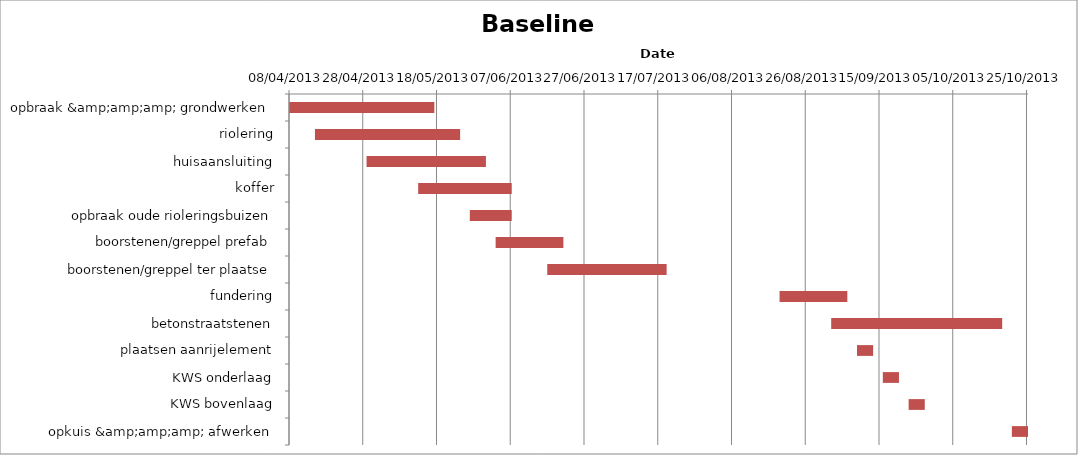
| Category | Baseline start | Actual duration |
|---|---|---|
| opbraak &amp;amp;amp; grondwerken | 41372.333 | 39.375 |
| riolering | 41379.333 | 39.375 |
| huisaansluiting | 41393.333 | 32.375 |
| koffer | 41407.333 | 25.375 |
| opbraak oude rioleringsbuizen | 41421.333 | 11.375 |
| boorstenen/greppel prefab | 41428.333 | 18.375 |
| boorstenen/greppel ter plaatse | 41442.333 | 32.375 |
| fundering | 41505.333 | 18.375 |
| betonstraatstenen | 41519.333 | 46.375 |
| plaatsen aanrijelement | 41526.333 | 4.375 |
| KWS onderlaag | 41533.333 | 4.375 |
| KWS bovenlaag | 41540.333 | 4.375 |
| opkuis &amp;amp;amp; afwerken | 41568.333 | 4.375 |